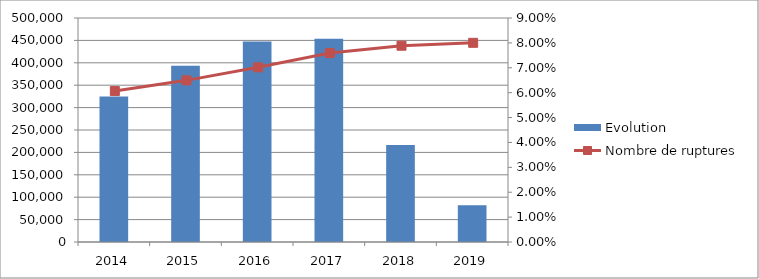
| Category | Evolution |
|---|---|
| 2014.0 | 0.058 |
| 2015.0 | 0.071 |
| 2016.0 | 0.081 |
| 2017.0 | 0.082 |
| 2018.0 | 0.039 |
| 2019.0 | 0.015 |